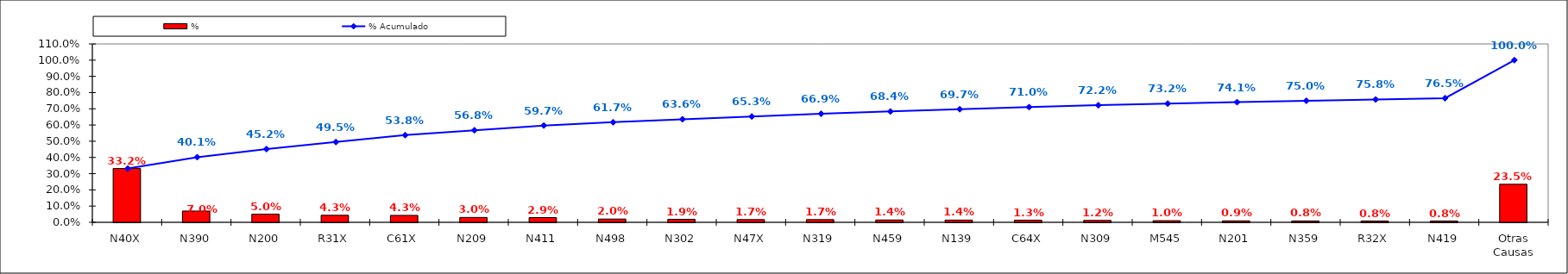
| Category | % |
|---|---|
| N40X | 0.332 |
| N390 | 0.07 |
| N200 | 0.05 |
| R31X | 0.043 |
| C61X | 0.043 |
| N209 | 0.03 |
| N411 | 0.029 |
| N498 | 0.02 |
| N302 | 0.019 |
| N47X | 0.017 |
| N319 | 0.017 |
| N459 | 0.014 |
| N139 | 0.014 |
| C64X | 0.013 |
| N309 | 0.012 |
| M545 | 0.01 |
| N201 | 0.009 |
| N359 | 0.008 |
| R32X | 0.008 |
| N419 | 0.008 |
| Otras Causas | 0.235 |